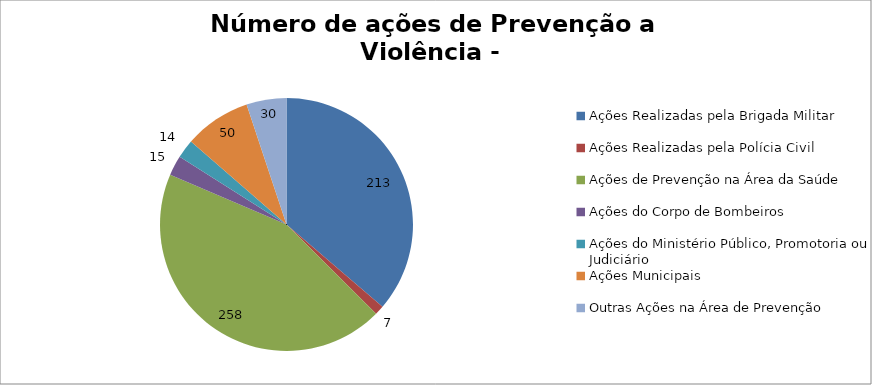
| Category | Número de Ações |
|---|---|
| Ações Realizadas pela Brigada Militar | 213 |
| Ações Realizadas pela Polícia Civil | 7 |
| Ações de Prevenção na Área da Saúde | 258 |
| Ações do Corpo de Bombeiros | 15 |
| Ações do Ministério Público, Promotoria ou Judiciário | 14 |
| Ações Municipais | 50 |
| Outras Ações na Área de Prevenção | 30 |